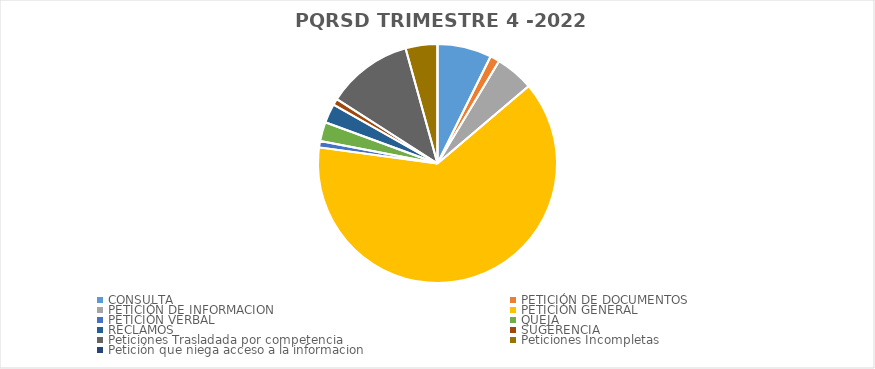
| Category | CANTIDAD |
|---|---|
| CONSULTA | 17 |
| PETICIÓN DE DOCUMENTOS | 3 |
| PETICIÓN DE INFORMACION | 12 |
| PETICIÓN GENERAL | 147 |
| PETICIÓN VERBAL | 2 |
| QUEJA | 6 |
| RECLAMOS | 6 |
| SUGERENCIA | 2 |
| Peticiones Trasladada por competencia  | 27 |
| Peticiones Incompletas | 10 |
| Petición que niega acceso a la informacion  | 0 |